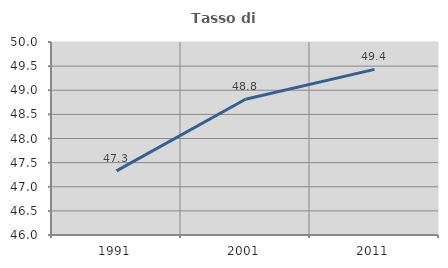
| Category | Tasso di occupazione   |
|---|---|
| 1991.0 | 47.329 |
| 2001.0 | 48.814 |
| 2011.0 | 49.432 |